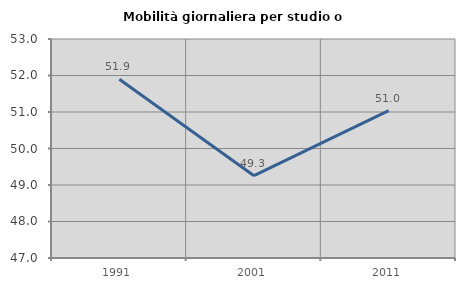
| Category | Mobilità giornaliera per studio o lavoro |
|---|---|
| 1991.0 | 51.897 |
| 2001.0 | 49.255 |
| 2011.0 | 51.04 |